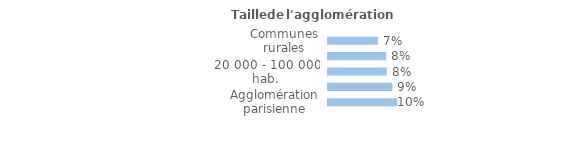
| Category | Series 0 |
|---|---|
| Communes rurales | 0.072 |
| moins de 20 000 hab. | 0.084 |
| 20 000 - 100 000 hab. | 0.084 |
| 100 000 hab. ou plus | 0.092 |
| Agglomération parisienne | 0.1 |